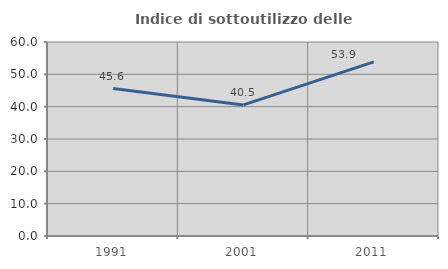
| Category | Indice di sottoutilizzo delle abitazioni  |
|---|---|
| 1991.0 | 45.614 |
| 2001.0 | 40.533 |
| 2011.0 | 53.868 |